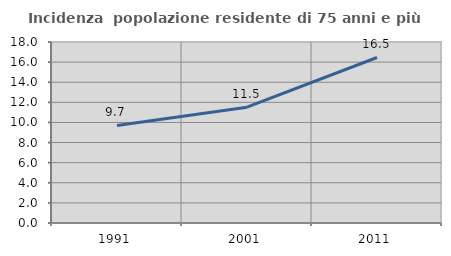
| Category | Incidenza  popolazione residente di 75 anni e più |
|---|---|
| 1991.0 | 9.699 |
| 2001.0 | 11.514 |
| 2011.0 | 16.46 |